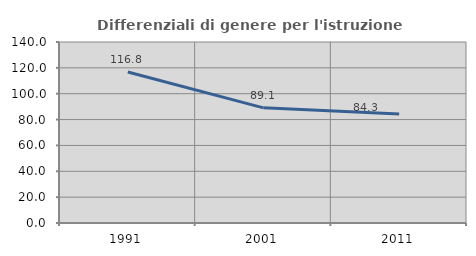
| Category | Differenziali di genere per l'istruzione superiore |
|---|---|
| 1991.0 | 116.757 |
| 2001.0 | 89.08 |
| 2011.0 | 84.295 |